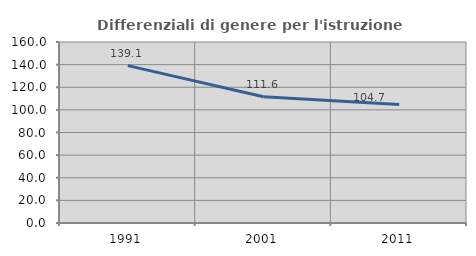
| Category | Differenziali di genere per l'istruzione superiore |
|---|---|
| 1991.0 | 139.092 |
| 2001.0 | 111.556 |
| 2011.0 | 104.737 |